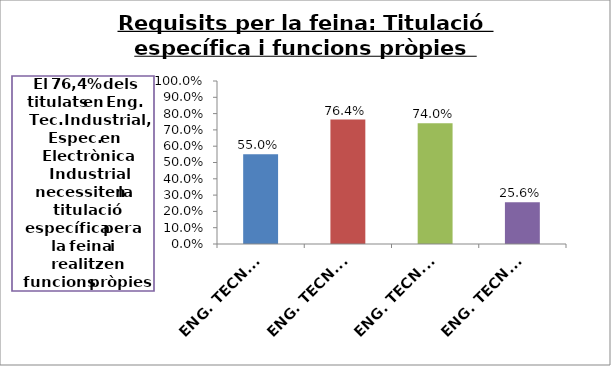
| Category | Series 0 |
|---|---|
| ENG. TECN. INDUSTRIAL, ESPEC. EN ELECTRICITAT | 0.55 |
| ENG. TECN. INDUSTRIAL, ESPEC. EN ELECTRONICA INDUSTRIAL | 0.764 |
| ENG. TECN. INDUSTRIAL, ESPEC. EN MECANICA | 0.74 |
| ENG. TECN. INDUSTRIAL, ESPEC. EN QUÍMICA INDUSTRIAL | 0.256 |